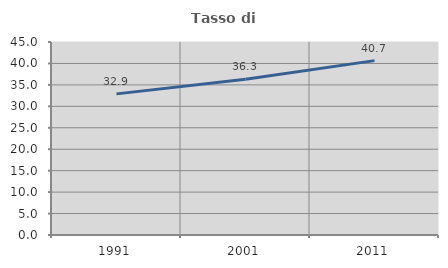
| Category | Tasso di occupazione   |
|---|---|
| 1991.0 | 32.906 |
| 2001.0 | 36.327 |
| 2011.0 | 40.656 |